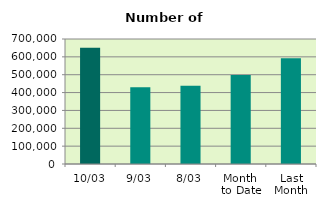
| Category | Series 0 |
|---|---|
| 10/03 | 651588 |
| 9/03 | 430140 |
| 8/03 | 438472 |
| Month 
to Date | 498050.75 |
| Last
Month | 592303 |